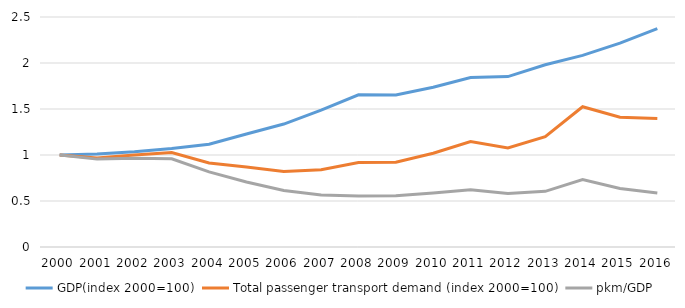
| Category | GDP(index 2000=100) | Total passenger transport demand (index 2000=100) | pkm/GDP |
|---|---|---|---|
| 2000.0 | 1 | 1 | 1 |
| 2001.0 | 1.012 | 0.966 | 0.955 |
| 2002.0 | 1.036 | 0.999 | 0.965 |
| 2003.0 | 1.071 | 1.027 | 0.959 |
| 2004.0 | 1.118 | 0.914 | 0.817 |
| 2005.0 | 1.229 | 0.869 | 0.707 |
| 2006.0 | 1.336 | 0.82 | 0.614 |
| 2007.0 | 1.488 | 0.84 | 0.565 |
| 2008.0 | 1.654 | 0.918 | 0.555 |
| 2009.0 | 1.653 | 0.921 | 0.557 |
| 2010.0 | 1.736 | 1.019 | 0.587 |
| 2011.0 | 1.842 | 1.146 | 0.622 |
| 2012.0 | 1.852 | 1.077 | 0.581 |
| 2013.0 | 1.981 | 1.199 | 0.605 |
| 2014.0 | 2.083 | 1.525 | 0.732 |
| 2015.0 | 2.216 | 1.41 | 0.636 |
| 2016.0 | 2.374 | 1.396 | 0.588 |